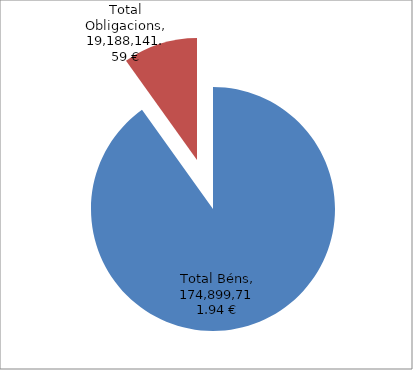
| Category | Series 0 |
|---|---|
| Total Béns | 174899711.94 |
| Total Obligacions | 19188141.59 |